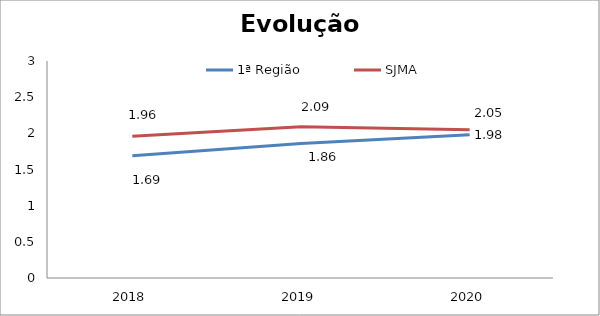
| Category | 1ª Região | SJMA |
|---|---|---|
| 0 | 1.69 | 1.96 |
| 1 | 1.86 | 2.09 |
| 2 | 1.98 | 2.05 |